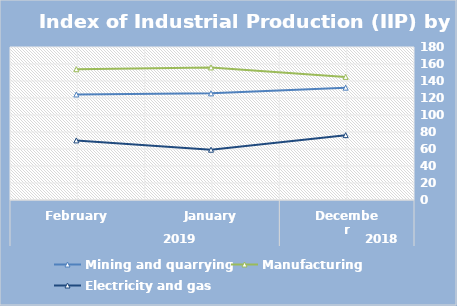
| Category | Mining and quarrying   | Manufacturing | Electricity and gas |
|---|---|---|---|
| 0 | 132.18 | 144.85 | 76.31 |
| 1 | 125.45 | 155.98 | 59.15 |
| 2 | 124.14 | 153.87 | 70.1 |